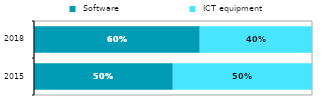
| Category |  Software |  ICT equipment |
|---|---|---|
| 2015.0 | 0.499 | 0.501 |
| 2018.0 | 0.596 | 0.404 |